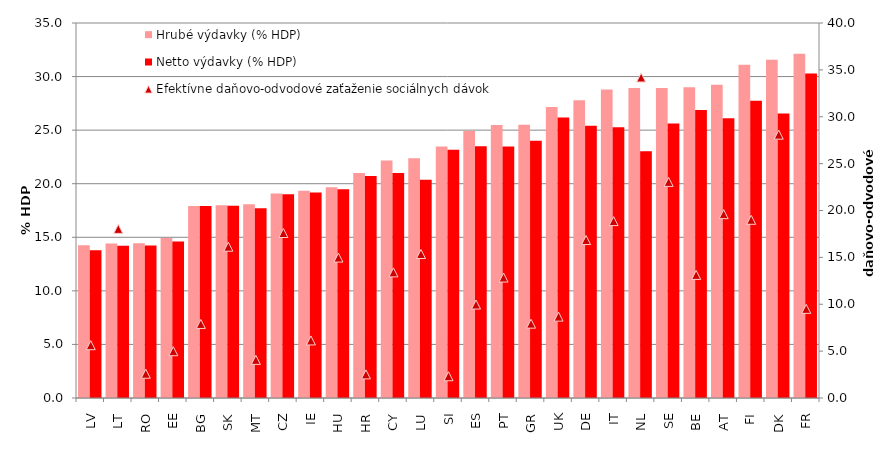
| Category | Hrubé výdavky (% HDP) | Netto výdavky (% HDP) |
|---|---|---|
| LV | 14.26 | 13.79 |
| LT | 14.41 | 14.2 |
| RO | 14.44 | 14.23 |
| EE | 14.94 | 14.61 |
| BG | 17.93 | 17.93 |
| SK | 17.99 | 17.94 |
| MT | 18.08 | 17.7 |
| CZ | 19.09 | 19.01 |
| IE | 19.34 | 19.18 |
| HU | 19.68 | 19.48 |
| HR | 21.01 | 20.72 |
| CY | 22.17 | 20.99 |
| LU | 22.38 | 20.37 |
| SI | 23.47 | 23.17 |
| ES | 24.91 | 23.5 |
| PT | 25.48 | 23.47 |
| GR | 25.5 | 24 |
| UK | 27.16 | 26.18 |
| DE | 27.79 | 25.4 |
| IT | 28.8 | 25.27 |
| NL | 28.93 | 23.03 |
| SE | 28.94 | 25.61 |
| BE | 29.01 | 26.88 |
| AT | 29.24 | 26.12 |
| FI | 31.11 | 27.74 |
| DK | 31.57 | 26.55 |
| FR | 32.12 | 30.28 |